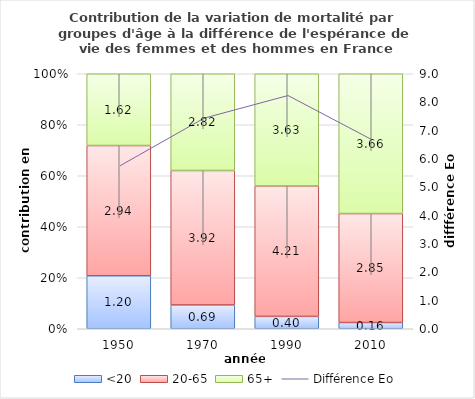
| Category | <20 | 20-65 | 65+ |
|---|---|---|---|
| 1950.0 | 1.197 | 2.942 | 1.621 |
| 1970.0 | 0.694 | 3.924 | 2.822 |
| 1990.0 | 0.4 | 4.214 | 3.626 |
| 2010.0 | 0.163 | 2.855 | 3.662 |